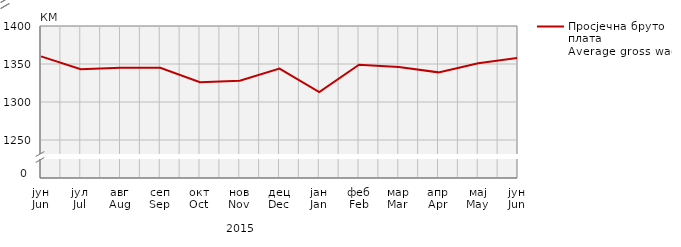
| Category | Просјечна бруто плата
Average gross wage |
|---|---|
| јун
Jun | 1360 |
| јул
Jul | 1343 |
| авг
Aug | 1345 |
| сеп
Sep | 1345 |
| окт
Oct | 1326 |
| нов
Nov | 1328 |
| дец
Dec | 1344 |
| јан
Jan | 1313 |
| феб
Feb | 1349 |
| мар
Mar | 1346 |
| апр
Apr | 1339 |
| мај
May | 1351 |
| јун
Jun | 1358 |